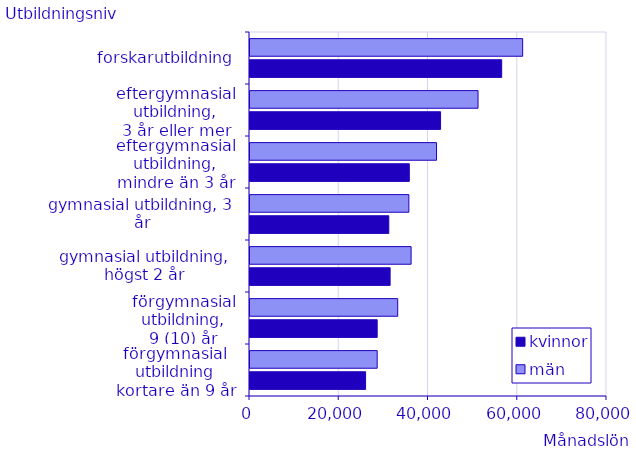
| Category | kvinnor | män |
|---|---|---|
| förgymnasial utbildning
kortare än 9 år | 25900 | 28500 |
| förgymnasial utbildning,
9 (10) år | 28500 | 33100 |
| gymnasial utbildning,
högst 2 år | 31400 | 36100 |
| gymnasial utbildning, 3 år | 31100 | 35600 |
| eftergymnasial utbildning,
mindre än 3 år | 35700 | 41800 |
| eftergymnasial utbildning,
3 år eller mer | 42700 | 51100 |
| forskarutbildning | 56400 | 61100 |